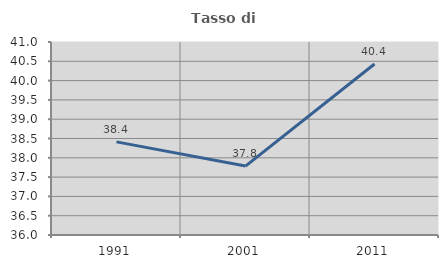
| Category | Tasso di occupazione   |
|---|---|
| 1991.0 | 38.412 |
| 2001.0 | 37.786 |
| 2011.0 | 40.431 |